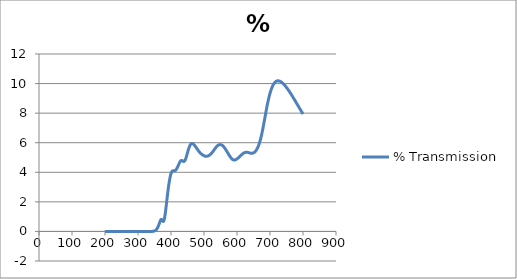
| Category | % Transmission |
|---|---|
| 800.0 | 7.94 |
| 799.0 | 7.977 |
| 798.0 | 8.013 |
| 797.0 | 8.049 |
| 796.0 | 8.088 |
| 795.0 | 8.122 |
| 794.0 | 8.166 |
| 793.0 | 8.206 |
| 792.0 | 8.235 |
| 791.0 | 8.272 |
| 790.0 | 8.315 |
| 789.0 | 8.35 |
| 788.0 | 8.388 |
| 787.0 | 8.434 |
| 786.0 | 8.463 |
| 785.0 | 8.499 |
| 784.0 | 8.541 |
| 783.0 | 8.577 |
| 782.0 | 8.615 |
| 781.0 | 8.655 |
| 780.0 | 8.69 |
| 779.0 | 8.722 |
| 778.0 | 8.762 |
| 777.0 | 8.807 |
| 776.0 | 8.845 |
| 775.0 | 8.885 |
| 774.0 | 8.914 |
| 773.0 | 8.947 |
| 772.0 | 8.992 |
| 771.0 | 9.026 |
| 770.0 | 9.062 |
| 769.0 | 9.104 |
| 768.0 | 9.136 |
| 767.0 | 9.172 |
| 766.0 | 9.214 |
| 765.0 | 9.243 |
| 764.0 | 9.281 |
| 763.0 | 9.322 |
| 762.0 | 9.348 |
| 761.0 | 9.382 |
| 760.0 | 9.417 |
| 759.0 | 9.453 |
| 758.0 | 9.488 |
| 757.0 | 9.52 |
| 756.0 | 9.55 |
| 755.0 | 9.58 |
| 754.0 | 9.618 |
| 753.0 | 9.647 |
| 752.0 | 9.679 |
| 751.0 | 9.708 |
| 750.0 | 9.736 |
| 749.0 | 9.759 |
| 748.0 | 9.796 |
| 747.0 | 9.819 |
| 746.0 | 9.855 |
| 745.0 | 9.879 |
| 744.0 | 9.897 |
| 743.0 | 9.924 |
| 742.0 | 9.952 |
| 741.0 | 9.971 |
| 740.0 | 9.998 |
| 739.0 | 10.019 |
| 738.0 | 10.036 |
| 737.0 | 10.055 |
| 736.0 | 10.072 |
| 735.0 | 10.09 |
| 734.0 | 10.109 |
| 733.0 | 10.126 |
| 732.0 | 10.134 |
| 731.0 | 10.141 |
| 730.0 | 10.159 |
| 729.0 | 10.166 |
| 728.0 | 10.174 |
| 727.0 | 10.18 |
| 726.0 | 10.177 |
| 725.0 | 10.182 |
| 724.0 | 10.188 |
| 723.0 | 10.184 |
| 722.0 | 10.186 |
| 721.0 | 10.175 |
| 720.0 | 10.159 |
| 719.0 | 10.152 |
| 718.0 | 10.142 |
| 717.0 | 10.126 |
| 716.0 | 10.109 |
| 715.0 | 10.081 |
| 714.0 | 10.054 |
| 713.0 | 10.03 |
| 712.0 | 9.997 |
| 711.0 | 9.964 |
| 710.0 | 9.933 |
| 709.0 | 9.893 |
| 708.0 | 9.84 |
| 707.0 | 9.791 |
| 706.0 | 9.74 |
| 705.0 | 9.682 |
| 704.0 | 9.625 |
| 703.0 | 9.558 |
| 702.0 | 9.482 |
| 701.0 | 9.414 |
| 700.0 | 9.343 |
| 699.0 | 9.259 |
| 698.0 | 9.178 |
| 697.0 | 9.085 |
| 696.0 | 8.984 |
| 695.0 | 8.885 |
| 694.0 | 8.788 |
| 693.0 | 8.684 |
| 692.0 | 8.582 |
| 691.0 | 8.471 |
| 690.0 | 8.352 |
| 689.0 | 8.237 |
| 688.0 | 8.116 |
| 687.0 | 7.996 |
| 686.0 | 7.873 |
| 685.0 | 7.749 |
| 684.0 | 7.626 |
| 683.0 | 7.504 |
| 682.0 | 7.381 |
| 681.0 | 7.263 |
| 680.0 | 7.147 |
| 679.0 | 7.022 |
| 678.0 | 6.911 |
| 677.0 | 6.798 |
| 676.0 | 6.683 |
| 675.0 | 6.584 |
| 674.0 | 6.484 |
| 673.0 | 6.385 |
| 672.0 | 6.301 |
| 671.0 | 6.216 |
| 670.0 | 6.13 |
| 669.0 | 6.055 |
| 668.0 | 5.985 |
| 667.0 | 5.916 |
| 666.0 | 5.851 |
| 665.0 | 5.79 |
| 664.0 | 5.733 |
| 663.0 | 5.685 |
| 662.0 | 5.639 |
| 661.0 | 5.595 |
| 660.0 | 5.556 |
| 659.0 | 5.52 |
| 658.0 | 5.482 |
| 657.0 | 5.453 |
| 656.0 | 5.427 |
| 655.0 | 5.4 |
| 654.0 | 5.38 |
| 653.0 | 5.361 |
| 652.0 | 5.34 |
| 651.0 | 5.328 |
| 650.0 | 5.316 |
| 649.0 | 5.303 |
| 648.0 | 5.299 |
| 647.0 | 5.292 |
| 646.0 | 5.285 |
| 645.0 | 5.285 |
| 644.0 | 5.286 |
| 643.0 | 5.288 |
| 642.0 | 5.29 |
| 641.0 | 5.294 |
| 640.0 | 5.297 |
| 639.0 | 5.303 |
| 638.0 | 5.312 |
| 637.0 | 5.318 |
| 636.0 | 5.323 |
| 635.0 | 5.329 |
| 634.0 | 5.333 |
| 633.0 | 5.341 |
| 632.0 | 5.348 |
| 631.0 | 5.349 |
| 630.0 | 5.352 |
| 629.0 | 5.352 |
| 628.0 | 5.349 |
| 627.0 | 5.352 |
| 626.0 | 5.347 |
| 625.0 | 5.339 |
| 624.0 | 5.338 |
| 623.0 | 5.329 |
| 622.0 | 5.317 |
| 621.0 | 5.307 |
| 620.0 | 5.294 |
| 619.0 | 5.279 |
| 618.0 | 5.265 |
| 617.0 | 5.246 |
| 616.0 | 5.225 |
| 615.0 | 5.207 |
| 614.0 | 5.187 |
| 613.0 | 5.165 |
| 612.0 | 5.145 |
| 611.0 | 5.121 |
| 610.0 | 5.102 |
| 609.0 | 5.085 |
| 608.0 | 5.059 |
| 607.0 | 5.036 |
| 606.0 | 5.018 |
| 605.0 | 4.998 |
| 604.0 | 4.977 |
| 603.0 | 4.961 |
| 602.0 | 4.945 |
| 601.0 | 4.926 |
| 600.0 | 4.909 |
| 599.0 | 4.892 |
| 598.0 | 4.876 |
| 597.0 | 4.864 |
| 596.0 | 4.851 |
| 595.0 | 4.843 |
| 594.0 | 4.838 |
| 593.0 | 4.831 |
| 592.0 | 4.825 |
| 591.0 | 4.828 |
| 590.0 | 4.833 |
| 589.0 | 4.84 |
| 588.0 | 4.85 |
| 587.0 | 4.863 |
| 586.0 | 4.878 |
| 585.0 | 4.9 |
| 584.0 | 4.923 |
| 583.0 | 4.945 |
| 582.0 | 4.972 |
| 581.0 | 4.998 |
| 580.0 | 5.027 |
| 579.0 | 5.061 |
| 578.0 | 5.094 |
| 577.0 | 5.131 |
| 576.0 | 5.166 |
| 575.0 | 5.199 |
| 574.0 | 5.237 |
| 573.0 | 5.273 |
| 572.0 | 5.312 |
| 571.0 | 5.35 |
| 570.0 | 5.387 |
| 569.0 | 5.424 |
| 568.0 | 5.461 |
| 567.0 | 5.501 |
| 566.0 | 5.534 |
| 565.0 | 5.567 |
| 564.0 | 5.604 |
| 563.0 | 5.633 |
| 562.0 | 5.66 |
| 561.0 | 5.693 |
| 560.0 | 5.72 |
| 559.0 | 5.745 |
| 558.0 | 5.771 |
| 557.0 | 5.793 |
| 556.0 | 5.81 |
| 555.0 | 5.828 |
| 554.0 | 5.839 |
| 553.0 | 5.848 |
| 552.0 | 5.861 |
| 551.0 | 5.868 |
| 550.0 | 5.87 |
| 549.0 | 5.873 |
| 548.0 | 5.869 |
| 547.0 | 5.866 |
| 546.0 | 5.866 |
| 545.0 | 5.853 |
| 544.0 | 5.841 |
| 543.0 | 5.833 |
| 542.0 | 5.813 |
| 541.0 | 5.797 |
| 540.0 | 5.78 |
| 539.0 | 5.752 |
| 538.0 | 5.73 |
| 537.0 | 5.705 |
| 536.0 | 5.675 |
| 535.0 | 5.648 |
| 534.0 | 5.62 |
| 533.0 | 5.587 |
| 532.0 | 5.556 |
| 531.0 | 5.526 |
| 530.0 | 5.491 |
| 529.0 | 5.457 |
| 528.0 | 5.433 |
| 527.0 | 5.403 |
| 526.0 | 5.371 |
| 525.0 | 5.347 |
| 524.0 | 5.315 |
| 523.0 | 5.289 |
| 522.0 | 5.269 |
| 521.0 | 5.244 |
| 520.0 | 5.227 |
| 519.0 | 5.207 |
| 518.0 | 5.187 |
| 517.0 | 5.171 |
| 516.0 | 5.156 |
| 515.0 | 5.141 |
| 514.0 | 5.128 |
| 513.0 | 5.116 |
| 512.0 | 5.106 |
| 511.0 | 5.095 |
| 510.0 | 5.091 |
| 509.0 | 5.088 |
| 508.0 | 5.082 |
| 507.0 | 5.083 |
| 506.0 | 5.08 |
| 505.0 | 5.083 |
| 504.0 | 5.092 |
| 503.0 | 5.092 |
| 502.0 | 5.103 |
| 501.0 | 5.113 |
| 500.0 | 5.121 |
| 499.0 | 5.132 |
| 498.0 | 5.146 |
| 497.0 | 5.159 |
| 496.0 | 5.175 |
| 495.0 | 5.189 |
| 494.0 | 5.201 |
| 493.0 | 5.218 |
| 492.0 | 5.238 |
| 491.0 | 5.256 |
| 490.0 | 5.276 |
| 489.0 | 5.298 |
| 488.0 | 5.32 |
| 487.0 | 5.348 |
| 486.0 | 5.378 |
| 485.0 | 5.4 |
| 484.0 | 5.43 |
| 483.0 | 5.462 |
| 482.0 | 5.491 |
| 481.0 | 5.519 |
| 480.0 | 5.557 |
| 479.0 | 5.584 |
| 478.0 | 5.618 |
| 477.0 | 5.654 |
| 476.0 | 5.681 |
| 475.0 | 5.714 |
| 474.0 | 5.745 |
| 473.0 | 5.773 |
| 472.0 | 5.802 |
| 471.0 | 5.831 |
| 470.0 | 5.854 |
| 469.0 | 5.876 |
| 468.0 | 5.899 |
| 467.0 | 5.914 |
| 466.0 | 5.93 |
| 465.0 | 5.943 |
| 464.0 | 5.945 |
| 463.0 | 5.943 |
| 462.0 | 5.937 |
| 461.0 | 5.921 |
| 460.0 | 5.896 |
| 459.0 | 5.872 |
| 458.0 | 5.834 |
| 457.0 | 5.787 |
| 456.0 | 5.74 |
| 455.0 | 5.684 |
| 454.0 | 5.622 |
| 453.0 | 5.557 |
| 452.0 | 5.483 |
| 451.0 | 5.402 |
| 450.0 | 5.331 |
| 449.0 | 5.246 |
| 448.0 | 5.169 |
| 447.0 | 5.095 |
| 446.0 | 5.014 |
| 445.0 | 4.946 |
| 444.0 | 4.89 |
| 443.0 | 4.832 |
| 442.0 | 4.798 |
| 441.0 | 4.766 |
| 440.0 | 4.741 |
| 439.0 | 4.735 |
| 438.0 | 4.737 |
| 437.0 | 4.74 |
| 436.0 | 4.759 |
| 435.0 | 4.776 |
| 434.0 | 4.787 |
| 433.0 | 4.79 |
| 432.0 | 4.8 |
| 431.0 | 4.798 |
| 430.0 | 4.784 |
| 429.0 | 4.764 |
| 428.0 | 4.733 |
| 427.0 | 4.695 |
| 426.0 | 4.658 |
| 425.0 | 4.611 |
| 424.0 | 4.565 |
| 423.0 | 4.518 |
| 422.0 | 4.46 |
| 421.0 | 4.411 |
| 420.0 | 4.364 |
| 419.0 | 4.316 |
| 418.0 | 4.273 |
| 417.0 | 4.233 |
| 416.0 | 4.191 |
| 415.0 | 4.162 |
| 414.0 | 4.139 |
| 413.0 | 4.123 |
| 412.0 | 4.112 |
| 411.0 | 4.104 |
| 410.0 | 4.097 |
| 409.0 | 4.097 |
| 408.0 | 4.102 |
| 407.0 | 4.103 |
| 406.0 | 4.1 |
| 405.0 | 4.096 |
| 404.0 | 4.08 |
| 403.0 | 4.052 |
| 402.0 | 4.024 |
| 401.0 | 3.973 |
| 400.0 | 3.915 |
| 399.0 | 3.841 |
| 398.0 | 3.743 |
| 397.0 | 3.639 |
| 396.0 | 3.523 |
| 395.0 | 3.393 |
| 394.0 | 3.258 |
| 393.0 | 3.11 |
| 392.0 | 2.948 |
| 391.0 | 2.777 |
| 390.0 | 2.604 |
| 389.0 | 2.417 |
| 388.0 | 2.224 |
| 387.0 | 2.026 |
| 386.0 | 1.823 |
| 385.0 | 1.628 |
| 384.0 | 1.449 |
| 383.0 | 1.28 |
| 382.0 | 1.123 |
| 381.0 | 0.984 |
| 380.0 | 0.864 |
| 379.0 | 0.774 |
| 378.0 | 0.711 |
| 377.0 | 0.679 |
| 376.0 | 0.676 |
| 375.0 | 0.699 |
| 374.0 | 0.729 |
| 373.0 | 0.77 |
| 372.0 | 0.8 |
| 371.0 | 0.812 |
| 370.0 | 0.807 |
| 369.0 | 0.783 |
| 368.0 | 0.741 |
| 367.0 | 0.686 |
| 366.0 | 0.626 |
| 365.0 | 0.562 |
| 364.0 | 0.5 |
| 363.0 | 0.441 |
| 362.0 | 0.383 |
| 361.0 | 0.334 |
| 360.0 | 0.285 |
| 359.0 | 0.237 |
| 358.0 | 0.197 |
| 357.0 | 0.164 |
| 356.0 | 0.131 |
| 355.0 | 0.109 |
| 354.0 | 0.088 |
| 353.0 | 0.066 |
| 352.0 | 0.052 |
| 351.0 | 0.041 |
| 350.0 | 0.032 |
| 349.0 | 0.023 |
| 348.0 | 0.015 |
| 347.0 | 0.011 |
| 346.0 | 0.007 |
| 345.0 | 0.005 |
| 344.0 | 0.002 |
| 343.0 | 0.004 |
| 342.0 | 0.001 |
| 341.0 | 0 |
| 340.0 | -0.002 |
| 339.0 | 0.001 |
| 338.0 | -0.001 |
| 337.0 | 0.002 |
| 336.0 | 0.002 |
| 335.0 | -0.001 |
| 334.0 | -0.003 |
| 333.0 | 0 |
| 332.0 | -0.001 |
| 331.0 | 0.003 |
| 330.0 | 0.002 |
| 329.0 | 0 |
| 328.0 | -0.001 |
| 327.0 | 0.001 |
| 326.0 | 0 |
| 325.0 | 0.003 |
| 324.0 | 0.001 |
| 323.0 | -0.001 |
| 322.0 | -0.003 |
| 321.0 | 0 |
| 320.0 | -0.001 |
| 319.0 | 0.002 |
| 318.0 | 0.002 |
| 317.0 | -0.001 |
| 316.0 | -0.001 |
| 315.0 | -0.001 |
| 314.0 | 0.004 |
| 313.0 | -0.001 |
| 312.0 | 0.001 |
| 311.0 | 0.001 |
| 310.0 | -0.001 |
| 309.0 | -0.001 |
| 308.0 | 0.003 |
| 307.0 | -0.001 |
| 306.0 | 0.001 |
| 305.0 | 0.001 |
| 304.0 | -0.001 |
| 303.0 | 0 |
| 302.0 | 0.003 |
| 301.0 | -0.001 |
| 300.0 | 0.001 |
| 299.0 | 0.001 |
| 298.0 | -0.001 |
| 297.0 | 0 |
| 296.0 | 0.001 |
| 295.0 | -0.002 |
| 294.0 | 0.003 |
| 293.0 | 0.003 |
| 292.0 | 0 |
| 291.0 | 0 |
| 290.0 | 0.002 |
| 289.0 | 0 |
| 288.0 | 0.003 |
| 287.0 | 0.002 |
| 286.0 | -0.001 |
| 285.0 | 0 |
| 284.0 | 0.002 |
| 283.0 | 0 |
| 282.0 | 0.004 |
| 281.0 | 0.003 |
| 280.0 | 0 |
| 279.0 | 0.001 |
| 278.0 | 0.002 |
| 277.0 | 0 |
| 276.0 | 0.003 |
| 275.0 | 0.001 |
| 274.0 | -0.002 |
| 273.0 | 0 |
| 272.0 | 0.001 |
| 271.0 | 0 |
| 270.0 | 0.003 |
| 269.0 | 0.002 |
| 268.0 | 0 |
| 267.0 | 0.001 |
| 266.0 | 0.002 |
| 265.0 | 0 |
| 264.0 | 0.002 |
| 263.0 | 0.002 |
| 262.0 | -0.001 |
| 261.0 | 0 |
| 260.0 | 0.002 |
| 259.0 | 0 |
| 258.0 | 0.002 |
| 257.0 | 0.002 |
| 256.0 | -0.001 |
| 255.0 | 0.001 |
| 254.0 | 0.001 |
| 253.0 | -0.001 |
| 252.0 | 0.002 |
| 251.0 | 0.001 |
| 250.0 | -0.002 |
| 299.0 | 0.001 |
| 298.0 | -0.002 |
| 297.0 | 0 |
| 296.0 | 0.001 |
| 295.0 | -0.001 |
| 294.0 | 0.002 |
| 293.0 | 0.001 |
| 292.0 | -0.002 |
| 291.0 | 0.002 |
| 290.0 | 0.003 |
| 289.0 | -0.002 |
| 288.0 | -0.002 |
| 287.0 | 0 |
| 286.0 | 0.001 |
| 285.0 | 0.001 |
| 284.0 | 0 |
| 283.0 | 0.001 |
| 282.0 | 0.001 |
| 281.0 | -0.001 |
| 280.0 | -0.003 |
| 279.0 | 0 |
| 278.0 | 0.002 |
| 277.0 | 0 |
| 276.0 | 0.002 |
| 275.0 | 0.001 |
| 274.0 | -0.001 |
| 273.0 | 0.002 |
| 272.0 | 0.002 |
| 271.0 | 0 |
| 270.0 | 0.002 |
| 269.0 | 0.001 |
| 268.0 | -0.002 |
| 267.0 | 0.001 |
| 266.0 | 0.001 |
| 265.0 | 0 |
| 264.0 | 0.002 |
| 263.0 | 0.001 |
| 262.0 | -0.001 |
| 261.0 | 0.001 |
| 260.0 | 0.001 |
| 259.0 | -0.001 |
| 258.0 | 0.001 |
| 257.0 | -0.001 |
| 256.0 | -0.001 |
| 255.0 | 0 |
| 254.0 | -0.002 |
| 253.0 | -0.001 |
| 252.0 | 0.003 |
| 251.0 | 0.002 |
| 250.0 | 0 |
| 249.0 | 0.002 |
| 248.0 | 0 |
| 247.0 | 0 |
| 246.0 | 0.002 |
| 245.0 | -0.001 |
| 244.0 | -0.003 |
| 243.0 | -0.001 |
| 242.0 | -0.002 |
| 241.0 | 0 |
| 240.0 | 0.003 |
| 239.0 | 0 |
| 238.0 | -0.002 |
| 237.0 | -0.001 |
| 236.0 | -0.001 |
| 235.0 | 0 |
| 234.0 | 0.002 |
| 233.0 | 0 |
| 232.0 | -0.002 |
| 231.0 | 0.001 |
| 230.0 | -0.001 |
| 229.0 | 0 |
| 228.0 | 0.003 |
| 227.0 | 0.001 |
| 226.0 | -0.001 |
| 225.0 | -0.001 |
| 224.0 | -0.002 |
| 223.0 | 0 |
| 222.0 | 0.002 |
| 221.0 | 0.001 |
| 220.0 | -0.001 |
| 219.0 | 0 |
| 218.0 | -0.001 |
| 217.0 | 0 |
| 216.0 | 0.002 |
| 215.0 | 0 |
| 214.0 | -0.001 |
| 213.0 | 0 |
| 212.0 | -0.002 |
| 211.0 | 0.001 |
| 210.0 | 0.002 |
| 209.0 | 0 |
| 208.0 | -0.003 |
| 207.0 | 0.001 |
| 206.0 | 0 |
| 205.0 | -0.002 |
| 204.0 | 0 |
| 203.0 | -0.001 |
| 202.0 | 0 |
| 201.0 | 0 |
| 200.0 | -0.004 |